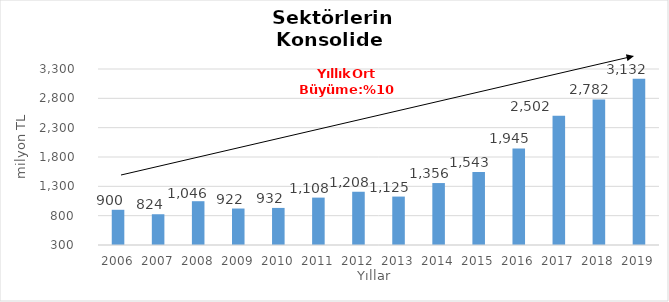
| Category | Toplam |
|---|---|
| 2006.0 | 900.249 |
| 2007.0 | 824.279 |
| 2008.0 | 1046.34 |
| 2009.0 | 921.592 |
| 2010.0 | 931.985 |
| 2011.0 | 1107.741 |
| 2012.0 | 1207.621 |
| 2013.0 | 1125.414 |
| 2014.0 | 1355.909 |
| 2015.0 | 1543 |
| 2016.0 | 1945 |
| 2017.0 | 2502 |
| 2018.0 | 2782 |
| 2019.0 | 3132 |